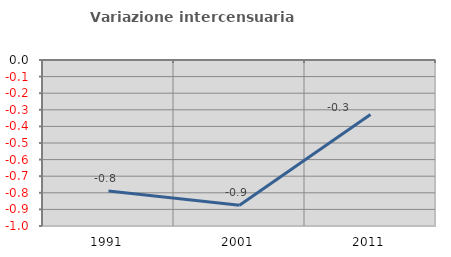
| Category | Variazione intercensuaria annua |
|---|---|
| 1991.0 | -0.789 |
| 2001.0 | -0.874 |
| 2011.0 | -0.329 |